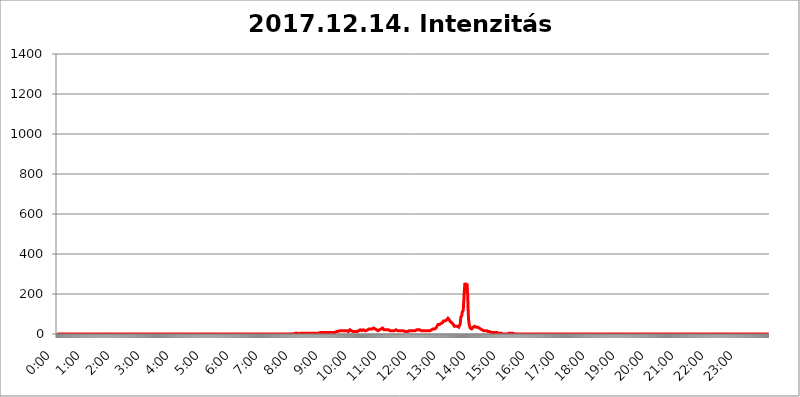
| Category | 2017.12.14. Intenzitás [W/m^2] |
|---|---|
| 0.0 | 0 |
| 0.0006944444444444445 | 0 |
| 0.001388888888888889 | 0 |
| 0.0020833333333333333 | 0 |
| 0.002777777777777778 | 0 |
| 0.003472222222222222 | 0 |
| 0.004166666666666667 | 0 |
| 0.004861111111111111 | 0 |
| 0.005555555555555556 | 0 |
| 0.0062499999999999995 | 0 |
| 0.006944444444444444 | 0 |
| 0.007638888888888889 | 0 |
| 0.008333333333333333 | 0 |
| 0.009027777777777779 | 0 |
| 0.009722222222222222 | 0 |
| 0.010416666666666666 | 0 |
| 0.011111111111111112 | 0 |
| 0.011805555555555555 | 0 |
| 0.012499999999999999 | 0 |
| 0.013194444444444444 | 0 |
| 0.013888888888888888 | 0 |
| 0.014583333333333332 | 0 |
| 0.015277777777777777 | 0 |
| 0.015972222222222224 | 0 |
| 0.016666666666666666 | 0 |
| 0.017361111111111112 | 0 |
| 0.018055555555555557 | 0 |
| 0.01875 | 0 |
| 0.019444444444444445 | 0 |
| 0.02013888888888889 | 0 |
| 0.020833333333333332 | 0 |
| 0.02152777777777778 | 0 |
| 0.022222222222222223 | 0 |
| 0.02291666666666667 | 0 |
| 0.02361111111111111 | 0 |
| 0.024305555555555556 | 0 |
| 0.024999999999999998 | 0 |
| 0.025694444444444447 | 0 |
| 0.02638888888888889 | 0 |
| 0.027083333333333334 | 0 |
| 0.027777777777777776 | 0 |
| 0.02847222222222222 | 0 |
| 0.029166666666666664 | 0 |
| 0.029861111111111113 | 0 |
| 0.030555555555555555 | 0 |
| 0.03125 | 0 |
| 0.03194444444444445 | 0 |
| 0.03263888888888889 | 0 |
| 0.03333333333333333 | 0 |
| 0.034027777777777775 | 0 |
| 0.034722222222222224 | 0 |
| 0.035416666666666666 | 0 |
| 0.036111111111111115 | 0 |
| 0.03680555555555556 | 0 |
| 0.0375 | 0 |
| 0.03819444444444444 | 0 |
| 0.03888888888888889 | 0 |
| 0.03958333333333333 | 0 |
| 0.04027777777777778 | 0 |
| 0.04097222222222222 | 0 |
| 0.041666666666666664 | 0 |
| 0.042361111111111106 | 0 |
| 0.04305555555555556 | 0 |
| 0.043750000000000004 | 0 |
| 0.044444444444444446 | 0 |
| 0.04513888888888889 | 0 |
| 0.04583333333333334 | 0 |
| 0.04652777777777778 | 0 |
| 0.04722222222222222 | 0 |
| 0.04791666666666666 | 0 |
| 0.04861111111111111 | 0 |
| 0.049305555555555554 | 0 |
| 0.049999999999999996 | 0 |
| 0.05069444444444445 | 0 |
| 0.051388888888888894 | 0 |
| 0.052083333333333336 | 0 |
| 0.05277777777777778 | 0 |
| 0.05347222222222222 | 0 |
| 0.05416666666666667 | 0 |
| 0.05486111111111111 | 0 |
| 0.05555555555555555 | 0 |
| 0.05625 | 0 |
| 0.05694444444444444 | 0 |
| 0.057638888888888885 | 0 |
| 0.05833333333333333 | 0 |
| 0.05902777777777778 | 0 |
| 0.059722222222222225 | 0 |
| 0.06041666666666667 | 0 |
| 0.061111111111111116 | 0 |
| 0.06180555555555556 | 0 |
| 0.0625 | 0 |
| 0.06319444444444444 | 0 |
| 0.06388888888888888 | 0 |
| 0.06458333333333334 | 0 |
| 0.06527777777777778 | 0 |
| 0.06597222222222222 | 0 |
| 0.06666666666666667 | 0 |
| 0.06736111111111111 | 0 |
| 0.06805555555555555 | 0 |
| 0.06874999999999999 | 0 |
| 0.06944444444444443 | 0 |
| 0.07013888888888889 | 0 |
| 0.07083333333333333 | 0 |
| 0.07152777777777779 | 0 |
| 0.07222222222222223 | 0 |
| 0.07291666666666667 | 0 |
| 0.07361111111111111 | 0 |
| 0.07430555555555556 | 0 |
| 0.075 | 0 |
| 0.07569444444444444 | 0 |
| 0.0763888888888889 | 0 |
| 0.07708333333333334 | 0 |
| 0.07777777777777778 | 0 |
| 0.07847222222222222 | 0 |
| 0.07916666666666666 | 0 |
| 0.0798611111111111 | 0 |
| 0.08055555555555556 | 0 |
| 0.08125 | 0 |
| 0.08194444444444444 | 0 |
| 0.08263888888888889 | 0 |
| 0.08333333333333333 | 0 |
| 0.08402777777777777 | 0 |
| 0.08472222222222221 | 0 |
| 0.08541666666666665 | 0 |
| 0.08611111111111112 | 0 |
| 0.08680555555555557 | 0 |
| 0.08750000000000001 | 0 |
| 0.08819444444444445 | 0 |
| 0.08888888888888889 | 0 |
| 0.08958333333333333 | 0 |
| 0.09027777777777778 | 0 |
| 0.09097222222222222 | 0 |
| 0.09166666666666667 | 0 |
| 0.09236111111111112 | 0 |
| 0.09305555555555556 | 0 |
| 0.09375 | 0 |
| 0.09444444444444444 | 0 |
| 0.09513888888888888 | 0 |
| 0.09583333333333333 | 0 |
| 0.09652777777777777 | 0 |
| 0.09722222222222222 | 0 |
| 0.09791666666666667 | 0 |
| 0.09861111111111111 | 0 |
| 0.09930555555555555 | 0 |
| 0.09999999999999999 | 0 |
| 0.10069444444444443 | 0 |
| 0.1013888888888889 | 0 |
| 0.10208333333333335 | 0 |
| 0.10277777777777779 | 0 |
| 0.10347222222222223 | 0 |
| 0.10416666666666667 | 0 |
| 0.10486111111111111 | 0 |
| 0.10555555555555556 | 0 |
| 0.10625 | 0 |
| 0.10694444444444444 | 0 |
| 0.1076388888888889 | 0 |
| 0.10833333333333334 | 0 |
| 0.10902777777777778 | 0 |
| 0.10972222222222222 | 0 |
| 0.1111111111111111 | 0 |
| 0.11180555555555556 | 0 |
| 0.11180555555555556 | 0 |
| 0.1125 | 0 |
| 0.11319444444444444 | 0 |
| 0.11388888888888889 | 0 |
| 0.11458333333333333 | 0 |
| 0.11527777777777777 | 0 |
| 0.11597222222222221 | 0 |
| 0.11666666666666665 | 0 |
| 0.1173611111111111 | 0 |
| 0.11805555555555557 | 0 |
| 0.11944444444444445 | 0 |
| 0.12013888888888889 | 0 |
| 0.12083333333333333 | 0 |
| 0.12152777777777778 | 0 |
| 0.12222222222222223 | 0 |
| 0.12291666666666667 | 0 |
| 0.12291666666666667 | 0 |
| 0.12361111111111112 | 0 |
| 0.12430555555555556 | 0 |
| 0.125 | 0 |
| 0.12569444444444444 | 0 |
| 0.12638888888888888 | 0 |
| 0.12708333333333333 | 0 |
| 0.16875 | 0 |
| 0.12847222222222224 | 0 |
| 0.12916666666666668 | 0 |
| 0.12986111111111112 | 0 |
| 0.13055555555555556 | 0 |
| 0.13125 | 0 |
| 0.13194444444444445 | 0 |
| 0.1326388888888889 | 0 |
| 0.13333333333333333 | 0 |
| 0.13402777777777777 | 0 |
| 0.13402777777777777 | 0 |
| 0.13472222222222222 | 0 |
| 0.13541666666666666 | 0 |
| 0.1361111111111111 | 0 |
| 0.13749999999999998 | 0 |
| 0.13819444444444443 | 0 |
| 0.1388888888888889 | 0 |
| 0.13958333333333334 | 0 |
| 0.14027777777777778 | 0 |
| 0.14097222222222222 | 0 |
| 0.14166666666666666 | 0 |
| 0.1423611111111111 | 0 |
| 0.14305555555555557 | 0 |
| 0.14375000000000002 | 0 |
| 0.14444444444444446 | 0 |
| 0.1451388888888889 | 0 |
| 0.1451388888888889 | 0 |
| 0.14652777777777778 | 0 |
| 0.14722222222222223 | 0 |
| 0.14791666666666667 | 0 |
| 0.1486111111111111 | 0 |
| 0.14930555555555555 | 0 |
| 0.15 | 0 |
| 0.15069444444444444 | 0 |
| 0.15138888888888888 | 0 |
| 0.15208333333333332 | 0 |
| 0.15277777777777776 | 0 |
| 0.15347222222222223 | 0 |
| 0.15416666666666667 | 0 |
| 0.15486111111111112 | 0 |
| 0.15555555555555556 | 0 |
| 0.15625 | 0 |
| 0.15694444444444444 | 0 |
| 0.15763888888888888 | 0 |
| 0.15833333333333333 | 0 |
| 0.15902777777777777 | 0 |
| 0.15972222222222224 | 0 |
| 0.16041666666666668 | 0 |
| 0.16111111111111112 | 0 |
| 0.16180555555555556 | 0 |
| 0.1625 | 0 |
| 0.16319444444444445 | 0 |
| 0.1638888888888889 | 0 |
| 0.16458333333333333 | 0 |
| 0.16527777777777777 | 0 |
| 0.16597222222222222 | 0 |
| 0.16666666666666666 | 0 |
| 0.1673611111111111 | 0 |
| 0.16805555555555554 | 0 |
| 0.16874999999999998 | 0 |
| 0.16944444444444443 | 0 |
| 0.17013888888888887 | 0 |
| 0.1708333333333333 | 0 |
| 0.17152777777777775 | 0 |
| 0.17222222222222225 | 0 |
| 0.1729166666666667 | 0 |
| 0.17361111111111113 | 0 |
| 0.17430555555555557 | 0 |
| 0.17500000000000002 | 0 |
| 0.17569444444444446 | 0 |
| 0.1763888888888889 | 0 |
| 0.17708333333333334 | 0 |
| 0.17777777777777778 | 0 |
| 0.17847222222222223 | 0 |
| 0.17916666666666667 | 0 |
| 0.1798611111111111 | 0 |
| 0.18055555555555555 | 0 |
| 0.18125 | 0 |
| 0.18194444444444444 | 0 |
| 0.1826388888888889 | 0 |
| 0.18333333333333335 | 0 |
| 0.1840277777777778 | 0 |
| 0.18472222222222223 | 0 |
| 0.18541666666666667 | 0 |
| 0.18611111111111112 | 0 |
| 0.18680555555555556 | 0 |
| 0.1875 | 0 |
| 0.18819444444444444 | 0 |
| 0.18888888888888888 | 0 |
| 0.18958333333333333 | 0 |
| 0.19027777777777777 | 0 |
| 0.1909722222222222 | 0 |
| 0.19166666666666665 | 0 |
| 0.19236111111111112 | 0 |
| 0.19305555555555554 | 0 |
| 0.19375 | 0 |
| 0.19444444444444445 | 0 |
| 0.1951388888888889 | 0 |
| 0.19583333333333333 | 0 |
| 0.19652777777777777 | 0 |
| 0.19722222222222222 | 0 |
| 0.19791666666666666 | 0 |
| 0.1986111111111111 | 0 |
| 0.19930555555555554 | 0 |
| 0.19999999999999998 | 0 |
| 0.20069444444444443 | 0 |
| 0.20138888888888887 | 0 |
| 0.2020833333333333 | 0 |
| 0.2027777777777778 | 0 |
| 0.2034722222222222 | 0 |
| 0.2041666666666667 | 0 |
| 0.20486111111111113 | 0 |
| 0.20555555555555557 | 0 |
| 0.20625000000000002 | 0 |
| 0.20694444444444446 | 0 |
| 0.2076388888888889 | 0 |
| 0.20833333333333334 | 0 |
| 0.20902777777777778 | 0 |
| 0.20972222222222223 | 0 |
| 0.21041666666666667 | 0 |
| 0.2111111111111111 | 0 |
| 0.21180555555555555 | 0 |
| 0.2125 | 0 |
| 0.21319444444444444 | 0 |
| 0.2138888888888889 | 0 |
| 0.21458333333333335 | 0 |
| 0.2152777777777778 | 0 |
| 0.21597222222222223 | 0 |
| 0.21666666666666667 | 0 |
| 0.21736111111111112 | 0 |
| 0.21805555555555556 | 0 |
| 0.21875 | 0 |
| 0.21944444444444444 | 0 |
| 0.22013888888888888 | 0 |
| 0.22083333333333333 | 0 |
| 0.22152777777777777 | 0 |
| 0.2222222222222222 | 0 |
| 0.22291666666666665 | 0 |
| 0.2236111111111111 | 0 |
| 0.22430555555555556 | 0 |
| 0.225 | 0 |
| 0.22569444444444445 | 0 |
| 0.2263888888888889 | 0 |
| 0.22708333333333333 | 0 |
| 0.22777777777777777 | 0 |
| 0.22847222222222222 | 0 |
| 0.22916666666666666 | 0 |
| 0.2298611111111111 | 0 |
| 0.23055555555555554 | 0 |
| 0.23124999999999998 | 0 |
| 0.23194444444444443 | 0 |
| 0.23263888888888887 | 0 |
| 0.2333333333333333 | 0 |
| 0.2340277777777778 | 0 |
| 0.2347222222222222 | 0 |
| 0.2354166666666667 | 0 |
| 0.23611111111111113 | 0 |
| 0.23680555555555557 | 0 |
| 0.23750000000000002 | 0 |
| 0.23819444444444446 | 0 |
| 0.2388888888888889 | 0 |
| 0.23958333333333334 | 0 |
| 0.24027777777777778 | 0 |
| 0.24097222222222223 | 0 |
| 0.24166666666666667 | 0 |
| 0.2423611111111111 | 0 |
| 0.24305555555555555 | 0 |
| 0.24375 | 0 |
| 0.24444444444444446 | 0 |
| 0.24513888888888888 | 0 |
| 0.24583333333333335 | 0 |
| 0.2465277777777778 | 0 |
| 0.24722222222222223 | 0 |
| 0.24791666666666667 | 0 |
| 0.24861111111111112 | 0 |
| 0.24930555555555556 | 0 |
| 0.25 | 0 |
| 0.25069444444444444 | 0 |
| 0.2513888888888889 | 0 |
| 0.2520833333333333 | 0 |
| 0.25277777777777777 | 0 |
| 0.2534722222222222 | 0 |
| 0.25416666666666665 | 0 |
| 0.2548611111111111 | 0 |
| 0.2555555555555556 | 0 |
| 0.25625000000000003 | 0 |
| 0.2569444444444445 | 0 |
| 0.2576388888888889 | 0 |
| 0.25833333333333336 | 0 |
| 0.2590277777777778 | 0 |
| 0.25972222222222224 | 0 |
| 0.2604166666666667 | 0 |
| 0.2611111111111111 | 0 |
| 0.26180555555555557 | 0 |
| 0.2625 | 0 |
| 0.26319444444444445 | 0 |
| 0.2638888888888889 | 0 |
| 0.26458333333333334 | 0 |
| 0.2652777777777778 | 0 |
| 0.2659722222222222 | 0 |
| 0.26666666666666666 | 0 |
| 0.2673611111111111 | 0 |
| 0.26805555555555555 | 0 |
| 0.26875 | 0 |
| 0.26944444444444443 | 0 |
| 0.2701388888888889 | 0 |
| 0.2708333333333333 | 0 |
| 0.27152777777777776 | 0 |
| 0.2722222222222222 | 0 |
| 0.27291666666666664 | 0 |
| 0.2736111111111111 | 0 |
| 0.2743055555555555 | 0 |
| 0.27499999999999997 | 0 |
| 0.27569444444444446 | 0 |
| 0.27638888888888885 | 0 |
| 0.27708333333333335 | 0 |
| 0.2777777777777778 | 0 |
| 0.27847222222222223 | 0 |
| 0.2791666666666667 | 0 |
| 0.2798611111111111 | 0 |
| 0.28055555555555556 | 0 |
| 0.28125 | 0 |
| 0.28194444444444444 | 0 |
| 0.2826388888888889 | 0 |
| 0.2833333333333333 | 0 |
| 0.28402777777777777 | 0 |
| 0.2847222222222222 | 0 |
| 0.28541666666666665 | 0 |
| 0.28611111111111115 | 0 |
| 0.28680555555555554 | 0 |
| 0.28750000000000003 | 0 |
| 0.2881944444444445 | 0 |
| 0.2888888888888889 | 0 |
| 0.28958333333333336 | 0 |
| 0.2902777777777778 | 0 |
| 0.29097222222222224 | 0 |
| 0.2916666666666667 | 0 |
| 0.2923611111111111 | 0 |
| 0.29305555555555557 | 0 |
| 0.29375 | 0 |
| 0.29444444444444445 | 0 |
| 0.2951388888888889 | 0 |
| 0.29583333333333334 | 0 |
| 0.2965277777777778 | 0 |
| 0.2972222222222222 | 0 |
| 0.29791666666666666 | 0 |
| 0.2986111111111111 | 0 |
| 0.29930555555555555 | 0 |
| 0.3 | 0 |
| 0.30069444444444443 | 0 |
| 0.3013888888888889 | 0 |
| 0.3020833333333333 | 0 |
| 0.30277777777777776 | 0 |
| 0.3034722222222222 | 0 |
| 0.30416666666666664 | 0 |
| 0.3048611111111111 | 0 |
| 0.3055555555555555 | 0 |
| 0.30624999999999997 | 0 |
| 0.3069444444444444 | 0 |
| 0.3076388888888889 | 0 |
| 0.30833333333333335 | 0 |
| 0.3090277777777778 | 0 |
| 0.30972222222222223 | 0 |
| 0.3104166666666667 | 0 |
| 0.3111111111111111 | 0 |
| 0.31180555555555556 | 0 |
| 0.3125 | 0 |
| 0.31319444444444444 | 0 |
| 0.3138888888888889 | 0 |
| 0.3145833333333333 | 0 |
| 0.31527777777777777 | 0 |
| 0.3159722222222222 | 0 |
| 0.31666666666666665 | 0 |
| 0.31736111111111115 | 0 |
| 0.31805555555555554 | 0 |
| 0.31875000000000003 | 0 |
| 0.3194444444444445 | 0 |
| 0.3201388888888889 | 0 |
| 0.32083333333333336 | 0 |
| 0.3215277777777778 | 0 |
| 0.32222222222222224 | 0 |
| 0.3229166666666667 | 0 |
| 0.3236111111111111 | 0 |
| 0.32430555555555557 | 0 |
| 0.325 | 0 |
| 0.32569444444444445 | 0 |
| 0.3263888888888889 | 0 |
| 0.32708333333333334 | 0 |
| 0.3277777777777778 | 0 |
| 0.3284722222222222 | 0 |
| 0.32916666666666666 | 0 |
| 0.3298611111111111 | 0 |
| 0.33055555555555555 | 0 |
| 0.33125 | 0 |
| 0.33194444444444443 | 3.525 |
| 0.3326388888888889 | 3.525 |
| 0.3333333333333333 | 3.525 |
| 0.3340277777777778 | 3.525 |
| 0.3347222222222222 | 3.525 |
| 0.3354166666666667 | 3.525 |
| 0.3361111111111111 | 3.525 |
| 0.3368055555555556 | 3.525 |
| 0.33749999999999997 | 3.525 |
| 0.33819444444444446 | 3.525 |
| 0.33888888888888885 | 3.525 |
| 0.33958333333333335 | 0 |
| 0.34027777777777773 | 3.525 |
| 0.34097222222222223 | 3.525 |
| 0.3416666666666666 | 3.525 |
| 0.3423611111111111 | 3.525 |
| 0.3430555555555555 | 3.525 |
| 0.34375 | 3.525 |
| 0.3444444444444445 | 3.525 |
| 0.3451388888888889 | 3.525 |
| 0.3458333333333334 | 3.525 |
| 0.34652777777777777 | 3.525 |
| 0.34722222222222227 | 3.525 |
| 0.34791666666666665 | 3.525 |
| 0.34861111111111115 | 3.525 |
| 0.34930555555555554 | 3.525 |
| 0.35000000000000003 | 3.525 |
| 0.3506944444444444 | 3.525 |
| 0.3513888888888889 | 3.525 |
| 0.3520833333333333 | 3.525 |
| 0.3527777777777778 | 3.525 |
| 0.3534722222222222 | 3.525 |
| 0.3541666666666667 | 3.525 |
| 0.3548611111111111 | 3.525 |
| 0.35555555555555557 | 3.525 |
| 0.35625 | 3.525 |
| 0.35694444444444445 | 3.525 |
| 0.3576388888888889 | 3.525 |
| 0.35833333333333334 | 3.525 |
| 0.3590277777777778 | 3.525 |
| 0.3597222222222222 | 3.525 |
| 0.36041666666666666 | 3.525 |
| 0.3611111111111111 | 3.525 |
| 0.36180555555555555 | 3.525 |
| 0.3625 | 3.525 |
| 0.36319444444444443 | 3.525 |
| 0.3638888888888889 | 3.525 |
| 0.3645833333333333 | 3.525 |
| 0.3652777777777778 | 3.525 |
| 0.3659722222222222 | 3.525 |
| 0.3666666666666667 | 3.525 |
| 0.3673611111111111 | 3.525 |
| 0.3680555555555556 | 3.525 |
| 0.36874999999999997 | 7.887 |
| 0.36944444444444446 | 7.887 |
| 0.37013888888888885 | 7.887 |
| 0.37083333333333335 | 7.887 |
| 0.37152777777777773 | 7.887 |
| 0.37222222222222223 | 7.887 |
| 0.3729166666666666 | 7.887 |
| 0.3736111111111111 | 7.887 |
| 0.3743055555555555 | 7.887 |
| 0.375 | 7.887 |
| 0.3756944444444445 | 7.887 |
| 0.3763888888888889 | 7.887 |
| 0.3770833333333334 | 7.887 |
| 0.37777777777777777 | 7.887 |
| 0.37847222222222227 | 7.887 |
| 0.37916666666666665 | 7.887 |
| 0.37986111111111115 | 7.887 |
| 0.38055555555555554 | 7.887 |
| 0.38125000000000003 | 7.887 |
| 0.3819444444444444 | 7.887 |
| 0.3826388888888889 | 7.887 |
| 0.3833333333333333 | 7.887 |
| 0.3840277777777778 | 7.887 |
| 0.3847222222222222 | 7.887 |
| 0.3854166666666667 | 7.887 |
| 0.3861111111111111 | 7.887 |
| 0.38680555555555557 | 7.887 |
| 0.3875 | 7.887 |
| 0.38819444444444445 | 7.887 |
| 0.3888888888888889 | 7.887 |
| 0.38958333333333334 | 7.887 |
| 0.3902777777777778 | 12.257 |
| 0.3909722222222222 | 12.257 |
| 0.39166666666666666 | 12.257 |
| 0.3923611111111111 | 12.257 |
| 0.39305555555555555 | 12.257 |
| 0.39375 | 12.257 |
| 0.39444444444444443 | 12.257 |
| 0.3951388888888889 | 16.636 |
| 0.3958333333333333 | 16.636 |
| 0.3965277777777778 | 16.636 |
| 0.3972222222222222 | 16.636 |
| 0.3979166666666667 | 16.636 |
| 0.3986111111111111 | 16.636 |
| 0.3993055555555556 | 16.636 |
| 0.39999999999999997 | 16.636 |
| 0.40069444444444446 | 16.636 |
| 0.40138888888888885 | 16.636 |
| 0.40208333333333335 | 16.636 |
| 0.40277777777777773 | 16.636 |
| 0.40347222222222223 | 16.636 |
| 0.4041666666666666 | 16.636 |
| 0.4048611111111111 | 16.636 |
| 0.4055555555555555 | 16.636 |
| 0.40625 | 16.636 |
| 0.4069444444444445 | 16.636 |
| 0.4076388888888889 | 16.636 |
| 0.4083333333333334 | 12.257 |
| 0.40902777777777777 | 16.636 |
| 0.40972222222222227 | 16.636 |
| 0.41041666666666665 | 21.024 |
| 0.41111111111111115 | 16.636 |
| 0.41180555555555554 | 16.636 |
| 0.41250000000000003 | 16.636 |
| 0.4131944444444444 | 12.257 |
| 0.4138888888888889 | 12.257 |
| 0.4145833333333333 | 12.257 |
| 0.4152777777777778 | 16.636 |
| 0.4159722222222222 | 12.257 |
| 0.4166666666666667 | 12.257 |
| 0.4173611111111111 | 16.636 |
| 0.41805555555555557 | 16.636 |
| 0.41875 | 12.257 |
| 0.41944444444444445 | 12.257 |
| 0.4201388888888889 | 12.257 |
| 0.42083333333333334 | 12.257 |
| 0.4215277777777778 | 12.257 |
| 0.4222222222222222 | 12.257 |
| 0.42291666666666666 | 16.636 |
| 0.4236111111111111 | 16.636 |
| 0.42430555555555555 | 21.024 |
| 0.425 | 21.024 |
| 0.42569444444444443 | 21.024 |
| 0.4263888888888889 | 21.024 |
| 0.4270833333333333 | 16.636 |
| 0.4277777777777778 | 16.636 |
| 0.4284722222222222 | 21.024 |
| 0.4291666666666667 | 21.024 |
| 0.4298611111111111 | 16.636 |
| 0.4305555555555556 | 16.636 |
| 0.43124999999999997 | 16.636 |
| 0.43194444444444446 | 16.636 |
| 0.43263888888888885 | 16.636 |
| 0.43333333333333335 | 16.636 |
| 0.43402777777777773 | 16.636 |
| 0.43472222222222223 | 21.024 |
| 0.4354166666666666 | 21.024 |
| 0.4361111111111111 | 21.024 |
| 0.4368055555555555 | 25.419 |
| 0.4375 | 25.419 |
| 0.4381944444444445 | 21.024 |
| 0.4388888888888889 | 21.024 |
| 0.4395833333333334 | 25.419 |
| 0.44027777777777777 | 25.419 |
| 0.44097222222222227 | 25.419 |
| 0.44166666666666665 | 25.419 |
| 0.44236111111111115 | 25.419 |
| 0.44305555555555554 | 29.823 |
| 0.44375000000000003 | 29.823 |
| 0.4444444444444444 | 29.823 |
| 0.4451388888888889 | 25.419 |
| 0.4458333333333333 | 25.419 |
| 0.4465277777777778 | 21.024 |
| 0.4472222222222222 | 25.419 |
| 0.4479166666666667 | 21.024 |
| 0.4486111111111111 | 21.024 |
| 0.44930555555555557 | 21.024 |
| 0.45 | 16.636 |
| 0.45069444444444445 | 16.636 |
| 0.4513888888888889 | 21.024 |
| 0.45208333333333334 | 21.024 |
| 0.4527777777777778 | 21.024 |
| 0.4534722222222222 | 25.419 |
| 0.45416666666666666 | 25.419 |
| 0.4548611111111111 | 25.419 |
| 0.45555555555555555 | 29.823 |
| 0.45625 | 29.823 |
| 0.45694444444444443 | 25.419 |
| 0.4576388888888889 | 25.419 |
| 0.4583333333333333 | 21.024 |
| 0.4590277777777778 | 21.024 |
| 0.4597222222222222 | 21.024 |
| 0.4604166666666667 | 21.024 |
| 0.4611111111111111 | 21.024 |
| 0.4618055555555556 | 21.024 |
| 0.46249999999999997 | 21.024 |
| 0.46319444444444446 | 21.024 |
| 0.46388888888888885 | 21.024 |
| 0.46458333333333335 | 21.024 |
| 0.46527777777777773 | 21.024 |
| 0.46597222222222223 | 16.636 |
| 0.4666666666666666 | 16.636 |
| 0.4673611111111111 | 21.024 |
| 0.4680555555555555 | 21.024 |
| 0.46875 | 16.636 |
| 0.4694444444444445 | 16.636 |
| 0.4701388888888889 | 16.636 |
| 0.4708333333333334 | 16.636 |
| 0.47152777777777777 | 16.636 |
| 0.47222222222222227 | 16.636 |
| 0.47291666666666665 | 16.636 |
| 0.47361111111111115 | 16.636 |
| 0.47430555555555554 | 21.024 |
| 0.47500000000000003 | 21.024 |
| 0.4756944444444444 | 21.024 |
| 0.4763888888888889 | 21.024 |
| 0.4770833333333333 | 16.636 |
| 0.4777777777777778 | 16.636 |
| 0.4784722222222222 | 16.636 |
| 0.4791666666666667 | 16.636 |
| 0.4798611111111111 | 12.257 |
| 0.48055555555555557 | 16.636 |
| 0.48125 | 16.636 |
| 0.48194444444444445 | 16.636 |
| 0.4826388888888889 | 16.636 |
| 0.48333333333333334 | 16.636 |
| 0.4840277777777778 | 16.636 |
| 0.4847222222222222 | 16.636 |
| 0.48541666666666666 | 16.636 |
| 0.4861111111111111 | 16.636 |
| 0.48680555555555555 | 12.257 |
| 0.4875 | 12.257 |
| 0.48819444444444443 | 12.257 |
| 0.4888888888888889 | 12.257 |
| 0.4895833333333333 | 12.257 |
| 0.4902777777777778 | 12.257 |
| 0.4909722222222222 | 12.257 |
| 0.4916666666666667 | 12.257 |
| 0.4923611111111111 | 12.257 |
| 0.4930555555555556 | 12.257 |
| 0.49374999999999997 | 16.636 |
| 0.49444444444444446 | 16.636 |
| 0.49513888888888885 | 16.636 |
| 0.49583333333333335 | 16.636 |
| 0.49652777777777773 | 16.636 |
| 0.49722222222222223 | 16.636 |
| 0.4979166666666666 | 16.636 |
| 0.4986111111111111 | 16.636 |
| 0.4993055555555555 | 16.636 |
| 0.5 | 16.636 |
| 0.5006944444444444 | 16.636 |
| 0.5013888888888889 | 21.024 |
| 0.5020833333333333 | 16.636 |
| 0.5027777777777778 | 16.636 |
| 0.5034722222222222 | 21.024 |
| 0.5041666666666667 | 21.024 |
| 0.5048611111111111 | 21.024 |
| 0.5055555555555555 | 21.024 |
| 0.50625 | 21.024 |
| 0.5069444444444444 | 21.024 |
| 0.5076388888888889 | 16.636 |
| 0.5083333333333333 | 21.024 |
| 0.5090277777777777 | 21.024 |
| 0.5097222222222222 | 21.024 |
| 0.5104166666666666 | 16.636 |
| 0.5111111111111112 | 16.636 |
| 0.5118055555555555 | 16.636 |
| 0.5125000000000001 | 16.636 |
| 0.5131944444444444 | 16.636 |
| 0.513888888888889 | 16.636 |
| 0.5145833333333333 | 16.636 |
| 0.5152777777777778 | 16.636 |
| 0.5159722222222222 | 16.636 |
| 0.5166666666666667 | 16.636 |
| 0.517361111111111 | 16.636 |
| 0.5180555555555556 | 16.636 |
| 0.5187499999999999 | 16.636 |
| 0.5194444444444445 | 16.636 |
| 0.5201388888888888 | 16.636 |
| 0.5208333333333334 | 16.636 |
| 0.5215277777777778 | 16.636 |
| 0.5222222222222223 | 16.636 |
| 0.5229166666666667 | 16.636 |
| 0.5236111111111111 | 21.024 |
| 0.5243055555555556 | 21.024 |
| 0.525 | 21.024 |
| 0.5256944444444445 | 25.419 |
| 0.5263888888888889 | 25.419 |
| 0.5270833333333333 | 25.419 |
| 0.5277777777777778 | 25.419 |
| 0.5284722222222222 | 25.419 |
| 0.5291666666666667 | 25.419 |
| 0.5298611111111111 | 29.823 |
| 0.5305555555555556 | 29.823 |
| 0.53125 | 29.823 |
| 0.5319444444444444 | 34.234 |
| 0.5326388888888889 | 38.653 |
| 0.5333333333333333 | 43.079 |
| 0.5340277777777778 | 47.511 |
| 0.5347222222222222 | 47.511 |
| 0.5354166666666667 | 47.511 |
| 0.5361111111111111 | 47.511 |
| 0.5368055555555555 | 47.511 |
| 0.5375 | 47.511 |
| 0.5381944444444444 | 51.951 |
| 0.5388888888888889 | 51.951 |
| 0.5395833333333333 | 56.398 |
| 0.5402777777777777 | 56.398 |
| 0.5409722222222222 | 60.85 |
| 0.5416666666666666 | 65.31 |
| 0.5423611111111112 | 65.31 |
| 0.5430555555555555 | 65.31 |
| 0.5437500000000001 | 65.31 |
| 0.5444444444444444 | 65.31 |
| 0.545138888888889 | 65.31 |
| 0.5458333333333333 | 69.775 |
| 0.5465277777777778 | 69.775 |
| 0.5472222222222222 | 74.246 |
| 0.5479166666666667 | 78.722 |
| 0.548611111111111 | 78.722 |
| 0.5493055555555556 | 74.246 |
| 0.5499999999999999 | 69.775 |
| 0.5506944444444445 | 65.31 |
| 0.5513888888888888 | 60.85 |
| 0.5520833333333334 | 56.398 |
| 0.5527777777777778 | 56.398 |
| 0.5534722222222223 | 56.398 |
| 0.5541666666666667 | 56.398 |
| 0.5548611111111111 | 51.951 |
| 0.5555555555555556 | 47.511 |
| 0.55625 | 43.079 |
| 0.5569444444444445 | 38.653 |
| 0.5576388888888889 | 38.653 |
| 0.5583333333333333 | 38.653 |
| 0.5590277777777778 | 38.653 |
| 0.5597222222222222 | 38.653 |
| 0.5604166666666667 | 38.653 |
| 0.5611111111111111 | 38.653 |
| 0.5618055555555556 | 34.234 |
| 0.5625 | 34.234 |
| 0.5631944444444444 | 34.234 |
| 0.5638888888888889 | 34.234 |
| 0.5645833333333333 | 38.653 |
| 0.5652777777777778 | 51.951 |
| 0.5659722222222222 | 83.205 |
| 0.5666666666666667 | 83.205 |
| 0.5673611111111111 | 92.184 |
| 0.5680555555555555 | 110.201 |
| 0.56875 | 114.716 |
| 0.5694444444444444 | 119.235 |
| 0.5701388888888889 | 164.605 |
| 0.5708333333333333 | 210.182 |
| 0.5715277777777777 | 242.127 |
| 0.5722222222222222 | 255.813 |
| 0.5729166666666666 | 223.873 |
| 0.5736111111111112 | 214.746 |
| 0.5743055555555555 | 251.251 |
| 0.5750000000000001 | 219.309 |
| 0.5756944444444444 | 191.937 |
| 0.576388888888889 | 105.69 |
| 0.5770833333333333 | 65.31 |
| 0.5777777777777778 | 47.511 |
| 0.5784722222222222 | 38.653 |
| 0.5791666666666667 | 29.823 |
| 0.579861111111111 | 25.419 |
| 0.5805555555555556 | 25.419 |
| 0.5812499999999999 | 25.419 |
| 0.5819444444444445 | 29.823 |
| 0.5826388888888888 | 29.823 |
| 0.5833333333333334 | 34.234 |
| 0.5840277777777778 | 34.234 |
| 0.5847222222222223 | 38.653 |
| 0.5854166666666667 | 38.653 |
| 0.5861111111111111 | 38.653 |
| 0.5868055555555556 | 38.653 |
| 0.5875 | 34.234 |
| 0.5881944444444445 | 34.234 |
| 0.5888888888888889 | 29.823 |
| 0.5895833333333333 | 34.234 |
| 0.5902777777777778 | 29.823 |
| 0.5909722222222222 | 29.823 |
| 0.5916666666666667 | 29.823 |
| 0.5923611111111111 | 29.823 |
| 0.5930555555555556 | 25.419 |
| 0.59375 | 25.419 |
| 0.5944444444444444 | 25.419 |
| 0.5951388888888889 | 25.419 |
| 0.5958333333333333 | 21.024 |
| 0.5965277777777778 | 21.024 |
| 0.5972222222222222 | 16.636 |
| 0.5979166666666667 | 16.636 |
| 0.5986111111111111 | 16.636 |
| 0.5993055555555555 | 16.636 |
| 0.6 | 16.636 |
| 0.6006944444444444 | 16.636 |
| 0.6013888888888889 | 16.636 |
| 0.6020833333333333 | 16.636 |
| 0.6027777777777777 | 12.257 |
| 0.6034722222222222 | 12.257 |
| 0.6041666666666666 | 12.257 |
| 0.6048611111111112 | 12.257 |
| 0.6055555555555555 | 12.257 |
| 0.6062500000000001 | 12.257 |
| 0.6069444444444444 | 7.887 |
| 0.607638888888889 | 7.887 |
| 0.6083333333333333 | 7.887 |
| 0.6090277777777778 | 3.525 |
| 0.6097222222222222 | 3.525 |
| 0.6104166666666667 | 7.887 |
| 0.611111111111111 | 7.887 |
| 0.6118055555555556 | 7.887 |
| 0.6124999999999999 | 7.887 |
| 0.6131944444444445 | 12.257 |
| 0.6138888888888888 | 12.257 |
| 0.6145833333333334 | 7.887 |
| 0.6152777777777778 | 7.887 |
| 0.6159722222222223 | 7.887 |
| 0.6166666666666667 | 7.887 |
| 0.6173611111111111 | 7.887 |
| 0.6180555555555556 | 3.525 |
| 0.61875 | 3.525 |
| 0.6194444444444445 | 3.525 |
| 0.6201388888888889 | 3.525 |
| 0.6208333333333333 | 3.525 |
| 0.6215277777777778 | 3.525 |
| 0.6222222222222222 | 3.525 |
| 0.6229166666666667 | 3.525 |
| 0.6236111111111111 | 3.525 |
| 0.6243055555555556 | 3.525 |
| 0.625 | 0 |
| 0.6256944444444444 | 3.525 |
| 0.6263888888888889 | 0 |
| 0.6270833333333333 | 0 |
| 0.6277777777777778 | 0 |
| 0.6284722222222222 | 0 |
| 0.6291666666666667 | 0 |
| 0.6298611111111111 | 0 |
| 0.6305555555555555 | 0 |
| 0.63125 | 0 |
| 0.6319444444444444 | 0 |
| 0.6326388888888889 | 0 |
| 0.6333333333333333 | 3.525 |
| 0.6340277777777777 | 3.525 |
| 0.6347222222222222 | 3.525 |
| 0.6354166666666666 | 3.525 |
| 0.6361111111111112 | 3.525 |
| 0.6368055555555555 | 3.525 |
| 0.6375000000000001 | 3.525 |
| 0.6381944444444444 | 3.525 |
| 0.638888888888889 | 0 |
| 0.6395833333333333 | 3.525 |
| 0.6402777777777778 | 3.525 |
| 0.6409722222222222 | 0 |
| 0.6416666666666667 | 0 |
| 0.642361111111111 | 0 |
| 0.6430555555555556 | 0 |
| 0.6437499999999999 | 0 |
| 0.6444444444444445 | 0 |
| 0.6451388888888888 | 0 |
| 0.6458333333333334 | 0 |
| 0.6465277777777778 | 0 |
| 0.6472222222222223 | 0 |
| 0.6479166666666667 | 0 |
| 0.6486111111111111 | 0 |
| 0.6493055555555556 | 0 |
| 0.65 | 0 |
| 0.6506944444444445 | 0 |
| 0.6513888888888889 | 0 |
| 0.6520833333333333 | 0 |
| 0.6527777777777778 | 0 |
| 0.6534722222222222 | 0 |
| 0.6541666666666667 | 0 |
| 0.6548611111111111 | 0 |
| 0.6555555555555556 | 0 |
| 0.65625 | 0 |
| 0.6569444444444444 | 0 |
| 0.6576388888888889 | 0 |
| 0.6583333333333333 | 0 |
| 0.6590277777777778 | 0 |
| 0.6597222222222222 | 0 |
| 0.6604166666666667 | 0 |
| 0.6611111111111111 | 0 |
| 0.6618055555555555 | 0 |
| 0.6625 | 0 |
| 0.6631944444444444 | 0 |
| 0.6638888888888889 | 0 |
| 0.6645833333333333 | 0 |
| 0.6652777777777777 | 0 |
| 0.6659722222222222 | 0 |
| 0.6666666666666666 | 0 |
| 0.6673611111111111 | 0 |
| 0.6680555555555556 | 0 |
| 0.6687500000000001 | 0 |
| 0.6694444444444444 | 0 |
| 0.6701388888888888 | 0 |
| 0.6708333333333334 | 0 |
| 0.6715277777777778 | 0 |
| 0.6722222222222222 | 0 |
| 0.6729166666666666 | 0 |
| 0.6736111111111112 | 0 |
| 0.6743055555555556 | 0 |
| 0.6749999999999999 | 0 |
| 0.6756944444444444 | 0 |
| 0.6763888888888889 | 0 |
| 0.6770833333333334 | 0 |
| 0.6777777777777777 | 0 |
| 0.6784722222222223 | 0 |
| 0.6791666666666667 | 0 |
| 0.6798611111111111 | 0 |
| 0.6805555555555555 | 0 |
| 0.68125 | 0 |
| 0.6819444444444445 | 0 |
| 0.6826388888888889 | 0 |
| 0.6833333333333332 | 0 |
| 0.6840277777777778 | 0 |
| 0.6847222222222222 | 0 |
| 0.6854166666666667 | 0 |
| 0.686111111111111 | 0 |
| 0.6868055555555556 | 0 |
| 0.6875 | 0 |
| 0.6881944444444444 | 0 |
| 0.688888888888889 | 0 |
| 0.6895833333333333 | 0 |
| 0.6902777777777778 | 0 |
| 0.6909722222222222 | 0 |
| 0.6916666666666668 | 0 |
| 0.6923611111111111 | 0 |
| 0.6930555555555555 | 0 |
| 0.69375 | 0 |
| 0.6944444444444445 | 0 |
| 0.6951388888888889 | 0 |
| 0.6958333333333333 | 0 |
| 0.6965277777777777 | 0 |
| 0.6972222222222223 | 0 |
| 0.6979166666666666 | 0 |
| 0.6986111111111111 | 0 |
| 0.6993055555555556 | 0 |
| 0.7000000000000001 | 0 |
| 0.7006944444444444 | 0 |
| 0.7013888888888888 | 0 |
| 0.7020833333333334 | 0 |
| 0.7027777777777778 | 0 |
| 0.7034722222222222 | 0 |
| 0.7041666666666666 | 0 |
| 0.7048611111111112 | 0 |
| 0.7055555555555556 | 0 |
| 0.7062499999999999 | 0 |
| 0.7069444444444444 | 0 |
| 0.7076388888888889 | 0 |
| 0.7083333333333334 | 0 |
| 0.7090277777777777 | 0 |
| 0.7097222222222223 | 0 |
| 0.7104166666666667 | 0 |
| 0.7111111111111111 | 0 |
| 0.7118055555555555 | 0 |
| 0.7125 | 0 |
| 0.7131944444444445 | 0 |
| 0.7138888888888889 | 0 |
| 0.7145833333333332 | 0 |
| 0.7152777777777778 | 0 |
| 0.7159722222222222 | 0 |
| 0.7166666666666667 | 0 |
| 0.717361111111111 | 0 |
| 0.7180555555555556 | 0 |
| 0.71875 | 0 |
| 0.7194444444444444 | 0 |
| 0.720138888888889 | 0 |
| 0.7208333333333333 | 0 |
| 0.7215277777777778 | 0 |
| 0.7222222222222222 | 0 |
| 0.7229166666666668 | 0 |
| 0.7236111111111111 | 0 |
| 0.7243055555555555 | 0 |
| 0.725 | 0 |
| 0.7256944444444445 | 0 |
| 0.7263888888888889 | 0 |
| 0.7270833333333333 | 0 |
| 0.7277777777777777 | 0 |
| 0.7284722222222223 | 0 |
| 0.7291666666666666 | 0 |
| 0.7298611111111111 | 0 |
| 0.7305555555555556 | 0 |
| 0.7312500000000001 | 0 |
| 0.7319444444444444 | 0 |
| 0.7326388888888888 | 0 |
| 0.7333333333333334 | 0 |
| 0.7340277777777778 | 0 |
| 0.7347222222222222 | 0 |
| 0.7354166666666666 | 0 |
| 0.7361111111111112 | 0 |
| 0.7368055555555556 | 0 |
| 0.7374999999999999 | 0 |
| 0.7381944444444444 | 0 |
| 0.7388888888888889 | 0 |
| 0.7395833333333334 | 0 |
| 0.7402777777777777 | 0 |
| 0.7409722222222223 | 0 |
| 0.7416666666666667 | 0 |
| 0.7423611111111111 | 0 |
| 0.7430555555555555 | 0 |
| 0.74375 | 0 |
| 0.7444444444444445 | 0 |
| 0.7451388888888889 | 0 |
| 0.7458333333333332 | 0 |
| 0.7465277777777778 | 0 |
| 0.7472222222222222 | 0 |
| 0.7479166666666667 | 0 |
| 0.748611111111111 | 0 |
| 0.7493055555555556 | 0 |
| 0.75 | 0 |
| 0.7506944444444444 | 0 |
| 0.751388888888889 | 0 |
| 0.7520833333333333 | 0 |
| 0.7527777777777778 | 0 |
| 0.7534722222222222 | 0 |
| 0.7541666666666668 | 0 |
| 0.7548611111111111 | 0 |
| 0.7555555555555555 | 0 |
| 0.75625 | 0 |
| 0.7569444444444445 | 0 |
| 0.7576388888888889 | 0 |
| 0.7583333333333333 | 0 |
| 0.7590277777777777 | 0 |
| 0.7597222222222223 | 0 |
| 0.7604166666666666 | 0 |
| 0.7611111111111111 | 0 |
| 0.7618055555555556 | 0 |
| 0.7625000000000001 | 0 |
| 0.7631944444444444 | 0 |
| 0.7638888888888888 | 0 |
| 0.7645833333333334 | 0 |
| 0.7652777777777778 | 0 |
| 0.7659722222222222 | 0 |
| 0.7666666666666666 | 0 |
| 0.7673611111111112 | 0 |
| 0.7680555555555556 | 0 |
| 0.7687499999999999 | 0 |
| 0.7694444444444444 | 0 |
| 0.7701388888888889 | 0 |
| 0.7708333333333334 | 0 |
| 0.7715277777777777 | 0 |
| 0.7722222222222223 | 0 |
| 0.7729166666666667 | 0 |
| 0.7736111111111111 | 0 |
| 0.7743055555555555 | 0 |
| 0.775 | 0 |
| 0.7756944444444445 | 0 |
| 0.7763888888888889 | 0 |
| 0.7770833333333332 | 0 |
| 0.7777777777777778 | 0 |
| 0.7784722222222222 | 0 |
| 0.7791666666666667 | 0 |
| 0.779861111111111 | 0 |
| 0.7805555555555556 | 0 |
| 0.78125 | 0 |
| 0.7819444444444444 | 0 |
| 0.782638888888889 | 0 |
| 0.7833333333333333 | 0 |
| 0.7840277777777778 | 0 |
| 0.7847222222222222 | 0 |
| 0.7854166666666668 | 0 |
| 0.7861111111111111 | 0 |
| 0.7868055555555555 | 0 |
| 0.7875 | 0 |
| 0.7881944444444445 | 0 |
| 0.7888888888888889 | 0 |
| 0.7895833333333333 | 0 |
| 0.7902777777777777 | 0 |
| 0.7909722222222223 | 0 |
| 0.7916666666666666 | 0 |
| 0.7923611111111111 | 0 |
| 0.7930555555555556 | 0 |
| 0.7937500000000001 | 0 |
| 0.7944444444444444 | 0 |
| 0.7951388888888888 | 0 |
| 0.7958333333333334 | 0 |
| 0.7965277777777778 | 0 |
| 0.7972222222222222 | 0 |
| 0.7979166666666666 | 0 |
| 0.7986111111111112 | 0 |
| 0.7993055555555556 | 0 |
| 0.7999999999999999 | 0 |
| 0.8006944444444444 | 0 |
| 0.8013888888888889 | 0 |
| 0.8020833333333334 | 0 |
| 0.8027777777777777 | 0 |
| 0.8034722222222223 | 0 |
| 0.8041666666666667 | 0 |
| 0.8048611111111111 | 0 |
| 0.8055555555555555 | 0 |
| 0.80625 | 0 |
| 0.8069444444444445 | 0 |
| 0.8076388888888889 | 0 |
| 0.8083333333333332 | 0 |
| 0.8090277777777778 | 0 |
| 0.8097222222222222 | 0 |
| 0.8104166666666667 | 0 |
| 0.811111111111111 | 0 |
| 0.8118055555555556 | 0 |
| 0.8125 | 0 |
| 0.8131944444444444 | 0 |
| 0.813888888888889 | 0 |
| 0.8145833333333333 | 0 |
| 0.8152777777777778 | 0 |
| 0.8159722222222222 | 0 |
| 0.8166666666666668 | 0 |
| 0.8173611111111111 | 0 |
| 0.8180555555555555 | 0 |
| 0.81875 | 0 |
| 0.8194444444444445 | 0 |
| 0.8201388888888889 | 0 |
| 0.8208333333333333 | 0 |
| 0.8215277777777777 | 0 |
| 0.8222222222222223 | 0 |
| 0.8229166666666666 | 0 |
| 0.8236111111111111 | 0 |
| 0.8243055555555556 | 0 |
| 0.8250000000000001 | 0 |
| 0.8256944444444444 | 0 |
| 0.8263888888888888 | 0 |
| 0.8270833333333334 | 0 |
| 0.8277777777777778 | 0 |
| 0.8284722222222222 | 0 |
| 0.8291666666666666 | 0 |
| 0.8298611111111112 | 0 |
| 0.8305555555555556 | 0 |
| 0.8312499999999999 | 0 |
| 0.8319444444444444 | 0 |
| 0.8326388888888889 | 0 |
| 0.8333333333333334 | 0 |
| 0.8340277777777777 | 0 |
| 0.8347222222222223 | 0 |
| 0.8354166666666667 | 0 |
| 0.8361111111111111 | 0 |
| 0.8368055555555555 | 0 |
| 0.8375 | 0 |
| 0.8381944444444445 | 0 |
| 0.8388888888888889 | 0 |
| 0.8395833333333332 | 0 |
| 0.8402777777777778 | 0 |
| 0.8409722222222222 | 0 |
| 0.8416666666666667 | 0 |
| 0.842361111111111 | 0 |
| 0.8430555555555556 | 0 |
| 0.84375 | 0 |
| 0.8444444444444444 | 0 |
| 0.845138888888889 | 0 |
| 0.8458333333333333 | 0 |
| 0.8465277777777778 | 0 |
| 0.8472222222222222 | 0 |
| 0.8479166666666668 | 0 |
| 0.8486111111111111 | 0 |
| 0.8493055555555555 | 0 |
| 0.85 | 0 |
| 0.8506944444444445 | 0 |
| 0.8513888888888889 | 0 |
| 0.8520833333333333 | 0 |
| 0.8527777777777777 | 0 |
| 0.8534722222222223 | 0 |
| 0.8541666666666666 | 0 |
| 0.8548611111111111 | 0 |
| 0.8555555555555556 | 0 |
| 0.8562500000000001 | 0 |
| 0.8569444444444444 | 0 |
| 0.8576388888888888 | 0 |
| 0.8583333333333334 | 0 |
| 0.8590277777777778 | 0 |
| 0.8597222222222222 | 0 |
| 0.8604166666666666 | 0 |
| 0.8611111111111112 | 0 |
| 0.8618055555555556 | 0 |
| 0.8624999999999999 | 0 |
| 0.8631944444444444 | 0 |
| 0.8638888888888889 | 0 |
| 0.8645833333333334 | 0 |
| 0.8652777777777777 | 0 |
| 0.8659722222222223 | 0 |
| 0.8666666666666667 | 0 |
| 0.8673611111111111 | 0 |
| 0.8680555555555555 | 0 |
| 0.86875 | 0 |
| 0.8694444444444445 | 0 |
| 0.8701388888888889 | 0 |
| 0.8708333333333332 | 0 |
| 0.8715277777777778 | 0 |
| 0.8722222222222222 | 0 |
| 0.8729166666666667 | 0 |
| 0.873611111111111 | 0 |
| 0.8743055555555556 | 0 |
| 0.875 | 0 |
| 0.8756944444444444 | 0 |
| 0.876388888888889 | 0 |
| 0.8770833333333333 | 0 |
| 0.8777777777777778 | 0 |
| 0.8784722222222222 | 0 |
| 0.8791666666666668 | 0 |
| 0.8798611111111111 | 0 |
| 0.8805555555555555 | 0 |
| 0.88125 | 0 |
| 0.8819444444444445 | 0 |
| 0.8826388888888889 | 0 |
| 0.8833333333333333 | 0 |
| 0.8840277777777777 | 0 |
| 0.8847222222222223 | 0 |
| 0.8854166666666666 | 0 |
| 0.8861111111111111 | 0 |
| 0.8868055555555556 | 0 |
| 0.8875000000000001 | 0 |
| 0.8881944444444444 | 0 |
| 0.8888888888888888 | 0 |
| 0.8895833333333334 | 0 |
| 0.8902777777777778 | 0 |
| 0.8909722222222222 | 0 |
| 0.8916666666666666 | 0 |
| 0.8923611111111112 | 0 |
| 0.8930555555555556 | 0 |
| 0.8937499999999999 | 0 |
| 0.8944444444444444 | 0 |
| 0.8951388888888889 | 0 |
| 0.8958333333333334 | 0 |
| 0.8965277777777777 | 0 |
| 0.8972222222222223 | 0 |
| 0.8979166666666667 | 0 |
| 0.8986111111111111 | 0 |
| 0.8993055555555555 | 0 |
| 0.9 | 0 |
| 0.9006944444444445 | 0 |
| 0.9013888888888889 | 0 |
| 0.9020833333333332 | 0 |
| 0.9027777777777778 | 0 |
| 0.9034722222222222 | 0 |
| 0.9041666666666667 | 0 |
| 0.904861111111111 | 0 |
| 0.9055555555555556 | 0 |
| 0.90625 | 0 |
| 0.9069444444444444 | 0 |
| 0.907638888888889 | 0 |
| 0.9083333333333333 | 0 |
| 0.9090277777777778 | 0 |
| 0.9097222222222222 | 0 |
| 0.9104166666666668 | 0 |
| 0.9111111111111111 | 0 |
| 0.9118055555555555 | 0 |
| 0.9125 | 0 |
| 0.9131944444444445 | 0 |
| 0.9138888888888889 | 0 |
| 0.9145833333333333 | 0 |
| 0.9152777777777777 | 0 |
| 0.9159722222222223 | 0 |
| 0.9166666666666666 | 0 |
| 0.9173611111111111 | 0 |
| 0.9180555555555556 | 0 |
| 0.9187500000000001 | 0 |
| 0.9194444444444444 | 0 |
| 0.9201388888888888 | 0 |
| 0.9208333333333334 | 0 |
| 0.9215277777777778 | 0 |
| 0.9222222222222222 | 0 |
| 0.9229166666666666 | 0 |
| 0.9236111111111112 | 0 |
| 0.9243055555555556 | 0 |
| 0.9249999999999999 | 0 |
| 0.9256944444444444 | 0 |
| 0.9263888888888889 | 0 |
| 0.9270833333333334 | 0 |
| 0.9277777777777777 | 0 |
| 0.9284722222222223 | 0 |
| 0.9291666666666667 | 0 |
| 0.9298611111111111 | 0 |
| 0.9305555555555555 | 0 |
| 0.93125 | 0 |
| 0.9319444444444445 | 0 |
| 0.9326388888888889 | 0 |
| 0.9333333333333332 | 0 |
| 0.9340277777777778 | 0 |
| 0.9347222222222222 | 0 |
| 0.9354166666666667 | 0 |
| 0.936111111111111 | 0 |
| 0.9368055555555556 | 0 |
| 0.9375 | 0 |
| 0.9381944444444444 | 0 |
| 0.938888888888889 | 0 |
| 0.9395833333333333 | 0 |
| 0.9402777777777778 | 0 |
| 0.9409722222222222 | 0 |
| 0.9416666666666668 | 0 |
| 0.9423611111111111 | 0 |
| 0.9430555555555555 | 0 |
| 0.94375 | 0 |
| 0.9444444444444445 | 0 |
| 0.9451388888888889 | 0 |
| 0.9458333333333333 | 0 |
| 0.9465277777777777 | 0 |
| 0.9472222222222223 | 0 |
| 0.9479166666666666 | 0 |
| 0.9486111111111111 | 0 |
| 0.9493055555555556 | 0 |
| 0.9500000000000001 | 0 |
| 0.9506944444444444 | 0 |
| 0.9513888888888888 | 0 |
| 0.9520833333333334 | 0 |
| 0.9527777777777778 | 0 |
| 0.9534722222222222 | 0 |
| 0.9541666666666666 | 0 |
| 0.9548611111111112 | 0 |
| 0.9555555555555556 | 0 |
| 0.9562499999999999 | 0 |
| 0.9569444444444444 | 0 |
| 0.9576388888888889 | 0 |
| 0.9583333333333334 | 0 |
| 0.9590277777777777 | 0 |
| 0.9597222222222223 | 0 |
| 0.9604166666666667 | 0 |
| 0.9611111111111111 | 0 |
| 0.9618055555555555 | 0 |
| 0.9625 | 0 |
| 0.9631944444444445 | 0 |
| 0.9638888888888889 | 0 |
| 0.9645833333333332 | 0 |
| 0.9652777777777778 | 0 |
| 0.9659722222222222 | 0 |
| 0.9666666666666667 | 0 |
| 0.967361111111111 | 0 |
| 0.9680555555555556 | 0 |
| 0.96875 | 0 |
| 0.9694444444444444 | 0 |
| 0.970138888888889 | 0 |
| 0.9708333333333333 | 0 |
| 0.9715277777777778 | 0 |
| 0.9722222222222222 | 0 |
| 0.9729166666666668 | 0 |
| 0.9736111111111111 | 0 |
| 0.9743055555555555 | 0 |
| 0.975 | 0 |
| 0.9756944444444445 | 0 |
| 0.9763888888888889 | 0 |
| 0.9770833333333333 | 0 |
| 0.9777777777777777 | 0 |
| 0.9784722222222223 | 0 |
| 0.9791666666666666 | 0 |
| 0.9798611111111111 | 0 |
| 0.9805555555555556 | 0 |
| 0.9812500000000001 | 0 |
| 0.9819444444444444 | 0 |
| 0.9826388888888888 | 0 |
| 0.9833333333333334 | 0 |
| 0.9840277777777778 | 0 |
| 0.9847222222222222 | 0 |
| 0.9854166666666666 | 0 |
| 0.9861111111111112 | 0 |
| 0.9868055555555556 | 0 |
| 0.9874999999999999 | 0 |
| 0.9881944444444444 | 0 |
| 0.9888888888888889 | 0 |
| 0.9895833333333334 | 0 |
| 0.9902777777777777 | 0 |
| 0.9909722222222223 | 0 |
| 0.9916666666666667 | 0 |
| 0.9923611111111111 | 0 |
| 0.9930555555555555 | 0 |
| 0.99375 | 0 |
| 0.9944444444444445 | 0 |
| 0.9951388888888889 | 0 |
| 0.9958333333333332 | 0 |
| 0.9965277777777778 | 0 |
| 0.9972222222222222 | 0 |
| 0.9979166666666667 | 0 |
| 0.998611111111111 | 0 |
| 0.9993055555555556 | 0 |